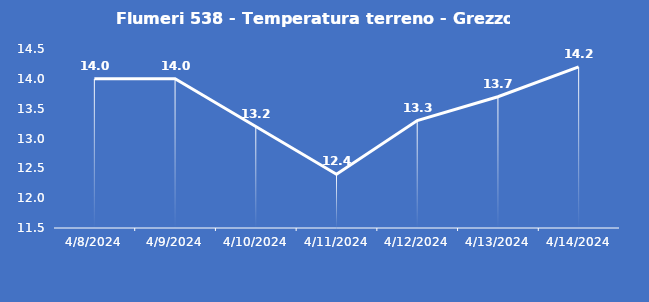
| Category | Flumeri 538 - Temperatura terreno - Grezzo (°C) |
|---|---|
| 4/8/24 | 14 |
| 4/9/24 | 14 |
| 4/10/24 | 13.2 |
| 4/11/24 | 12.4 |
| 4/12/24 | 13.3 |
| 4/13/24 | 13.7 |
| 4/14/24 | 14.2 |